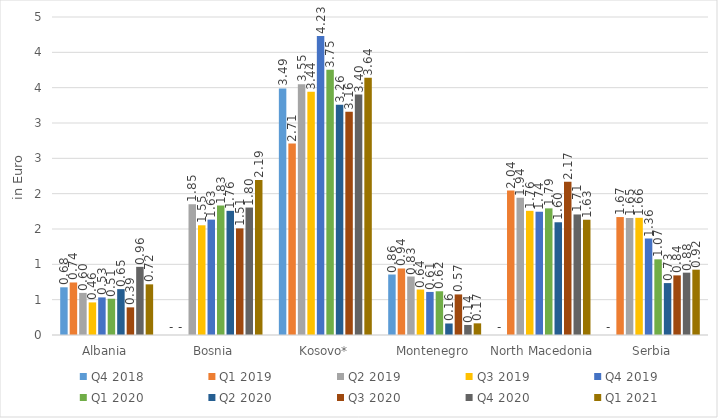
| Category | Q4 2018 | Q1 2019 | Q2 2019 | Q3 2019 | Q4 2019 | Q1 2020 | Q2 2020 | Q3 2020 | Q4 2020 | Q1 2021 |
|---|---|---|---|---|---|---|---|---|---|---|
| Albania | 0.675 | 0.743 | 0.596 | 0.461 | 0.532 | 0.513 | 0.649 | 0.391 | 0.964 | 0.717 |
| Bosnia | 0 | 0 | 1.85 | 1.552 | 1.633 | 1.832 | 1.757 | 1.509 | 1.804 | 2.194 |
| Kosovo* | 3.489 | 2.709 | 3.549 | 3.441 | 4.232 | 3.755 | 3.257 | 3.158 | 3.403 | 3.64 |
| Montenegro | 0.856 | 0.941 | 0.828 | 0.644 | 0.609 | 0.619 | 0.163 | 0.574 | 0.142 | 0.165 |
| North Macedonia | 0 | 2.044 | 1.943 | 1.757 | 1.744 | 1.792 | 1.595 | 2.168 | 1.706 | 1.633 |
| Serbia | 0 | 1.669 | 1.654 | 1.658 | 1.364 | 1.071 | 0.735 | 0.844 | 0.882 | 0.924 |